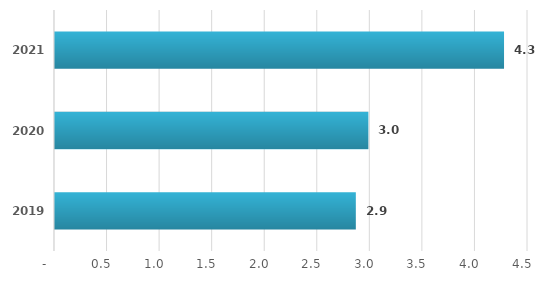
| Category | Series 0 |
|---|---|
| 2019.0 | 2.862 |
| 2020.0 | 2.982 |
| 2021.0 | 4.272 |